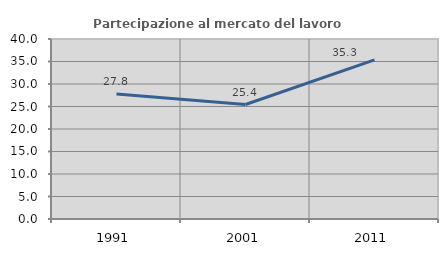
| Category | Partecipazione al mercato del lavoro  femminile |
|---|---|
| 1991.0 | 27.778 |
| 2001.0 | 25.439 |
| 2011.0 | 35.345 |